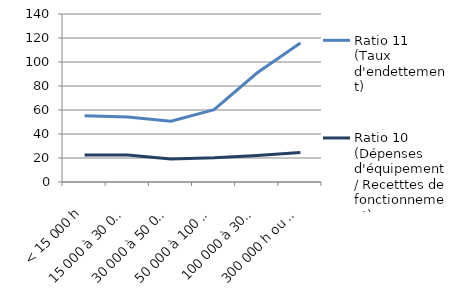
| Category | Ratio 11
(Taux d'endettement) | Ratio 10 
(Dépenses d'équipement
/ Recetttes de fonctionnement) |
|---|---|---|
| < 15 000 h | 55.15 | 22.496 |
| 15 000 à 30 000 h | 54.232 | 22.492 |
| 30 000 à 50 000 h | 50.574 | 19.265 |
| 50 000 à 100 000 h | 60.238 | 20.28 |
| 100 000 à 300 000 h | 91.016 | 22.183 |
| 300 000 h ou plus | 115.832 | 24.57 |